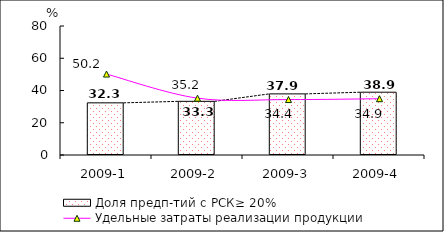
| Category | Доля предп-тий с РСК≥ 20% |
|---|---|
| 2009-1 | 32.343 |
| 2009-2 | 33.28 |
| 2009-3 | 37.903 |
| 2009-4 | 38.944 |